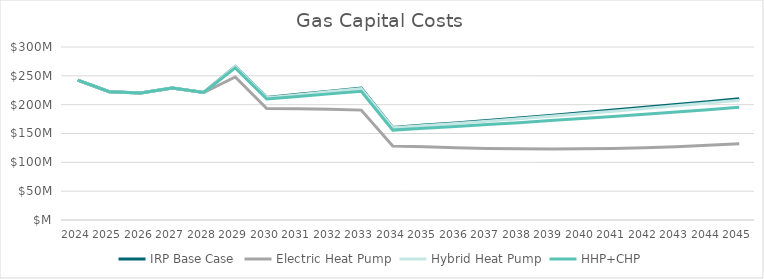
| Category | IRP Base Case | Electric Heat Pump | Hybrid Heat Pump | HHP+CHP |
|---|---|---|---|---|
| 2024.0 | 242548278.379 | 242548278.379 | 242548278.379 | 242548278.379 |
| 2025.0 | 222476653.545 | 222476653.545 | 222476653.545 | 222476653.545 |
| 2026.0 | 220263067.354 | 220263067.354 | 220263067.354 | 220263067.354 |
| 2027.0 | 228734371.473 | 228734371.473 | 228734371.473 | 228734371.473 |
| 2028.0 | 221129867.635 | 221129867.635 | 221129867.635 | 221129867.635 |
| 2029.0 | 266307975.356 | 248065676.992 | 265989154.459 | 263689137.174 |
| 2030.0 | 212549668.255 | 193154927.531 | 212192649.937 | 209748252.398 |
| 2031.0 | 217863409.962 | 192753934.938 | 217377505.316 | 214214398.819 |
| 2032.0 | 223309995.211 | 191845776.917 | 222671954.831 | 218710752.773 |
| 2033.0 | 228892745.091 | 190555981.061 | 228079993.722 | 223261578.854 |
| 2034.0 | 160626177.064 | 128441527.024 | 159916137.723 | 155878461.251 |
| 2035.0 | 164641831.491 | 127096712.871 | 163784883.551 | 159085460.951 |
| 2036.0 | 168421655.072 | 125428975.634 | 167411622.577 | 162044038.547 |
| 2037.0 | 172632196.449 | 123955794.112 | 171461339.145 | 165401142.731 |
| 2038.0 | 176948001.36 | 123431286.566 | 175611402.628 | 168840516.389 |
| 2039.0 | 181371701.394 | 123243908.626 | 179864261.94 | 172364338.117 |
| 2040.0 | 185905993.929 | 123475464.478 | 184224299.45 | 175972907.744 |
| 2041.0 | 190553643.777 | 124189522.486 | 188693567.086 | 179664113.799 |
| 2042.0 | 195317484.871 | 125421082.523 | 193275309.901 | 183444442.271 |
| 2043.0 | 200200421.993 | 127164705.434 | 197972827.519 | 187314700.788 |
| 2044.0 | 205205432.543 | 129439649.245 | 202787071.065 | 191275003.24 |
| 2045.0 | 210335568.356 | 132097274.038 | 207724913.641 | 195333604.193 |